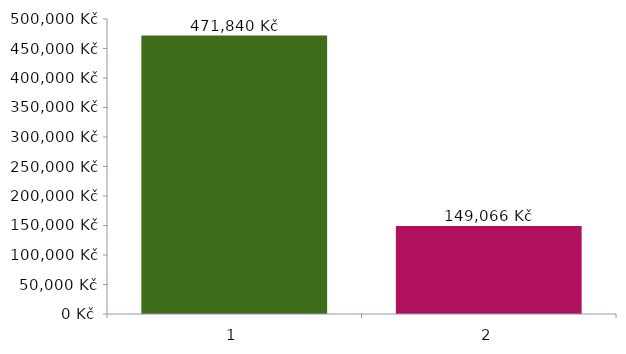
| Category | Series 0 |
|---|---|
| 0 | 471840 |
| 1 | 149066 |